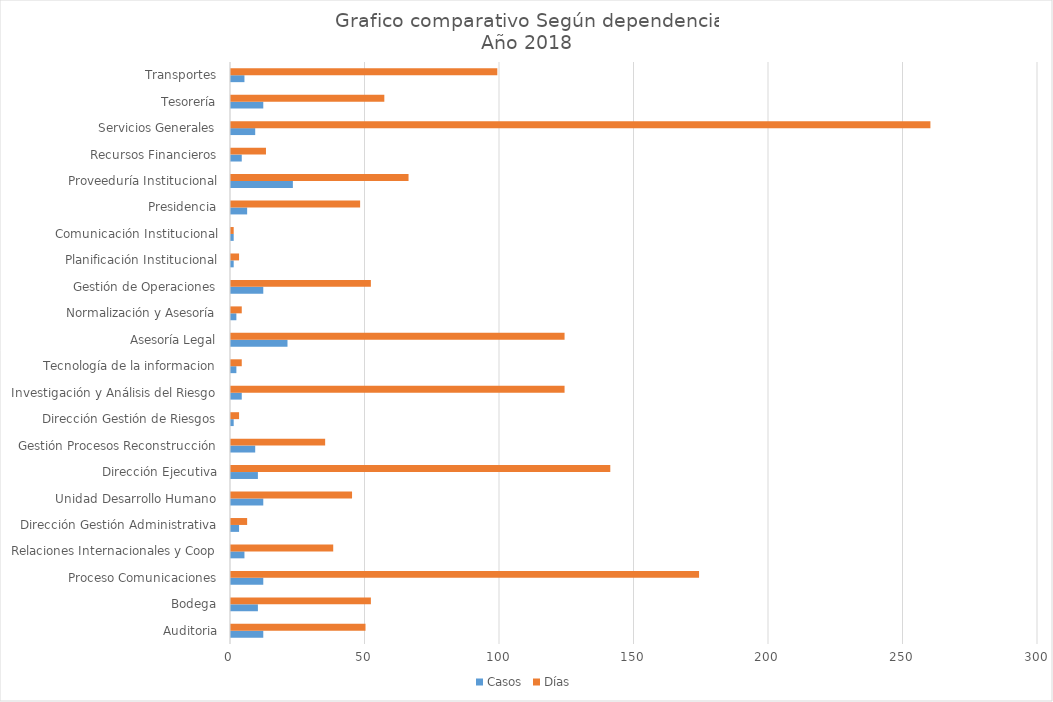
| Category | Casos | Días |
|---|---|---|
| Auditoria | 12 | 50 |
| Bodega | 10 | 52 |
| Proceso Comunicaciones | 12 | 174 |
| Relaciones Internacionales y Coop | 5 | 38 |
| Dirección Gestión Administrativa | 3 | 6 |
| Unidad Desarrollo Humano | 12 | 45 |
| Dirección Ejecutiva | 10 | 141 |
| Gestión Procesos Reconstrucción | 9 | 35 |
| Dirección Gestión de Riesgos | 1 | 3 |
| Investigación y Análisis del Riesgo | 4 | 124 |
| Tecnología de la informacion | 2 | 4 |
| Asesoría Legal | 21 | 124 |
| Normalización y Asesoría | 2 | 4 |
| Gestión de Operaciones | 12 | 52 |
| Planificación Institucional | 1 | 3 |
| Comunicación Institucional | 1 | 1 |
| Presidencia | 6 | 48 |
| Proveeduría Institucional | 23 | 66 |
| Recursos Financieros | 4 | 13 |
| Servicios Generales | 9 | 260 |
| Tesorería | 12 | 57 |
| Transportes | 5 | 99 |